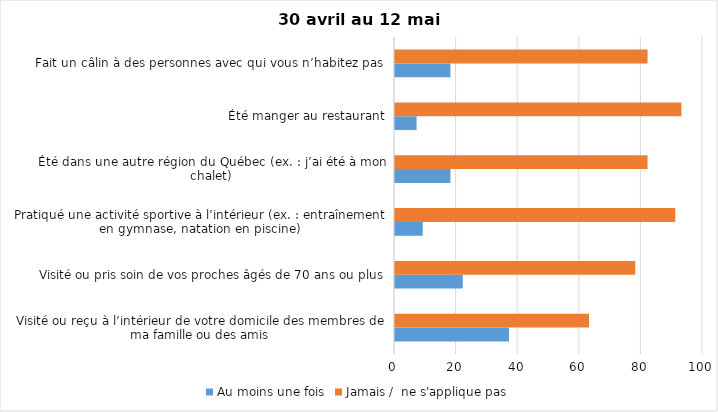
| Category | Au moins une fois | Jamais /  ne s'applique pas |
|---|---|---|
| Visité ou reçu à l’intérieur de votre domicile des membres de ma famille ou des amis | 37 | 63 |
| Visité ou pris soin de vos proches âgés de 70 ans ou plus | 22 | 78 |
| Pratiqué une activité sportive à l’intérieur (ex. : entraînement en gymnase, natation en piscine) | 9 | 91 |
| Été dans une autre région du Québec (ex. : j’ai été à mon chalet) | 18 | 82 |
| Été manger au restaurant | 7 | 93 |
| Fait un câlin à des personnes avec qui vous n’habitez pas | 18 | 82 |